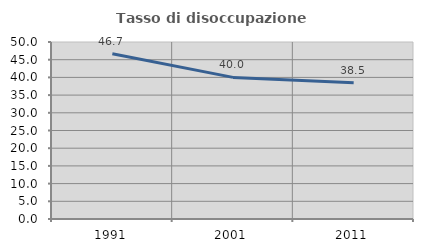
| Category | Tasso di disoccupazione giovanile  |
|---|---|
| 1991.0 | 46.667 |
| 2001.0 | 40 |
| 2011.0 | 38.462 |